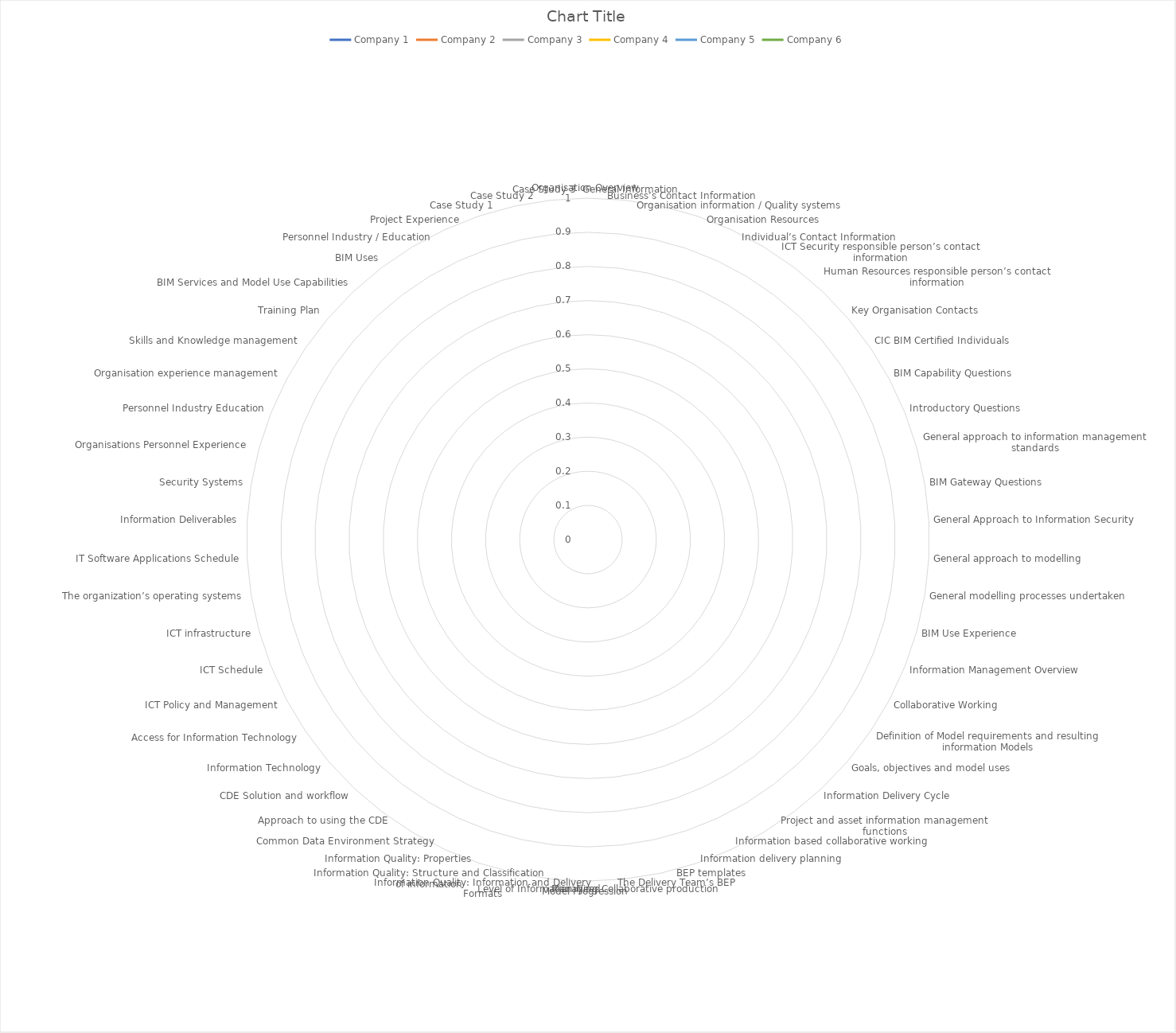
| Category | Company 1 | Company 2 | Company 3 | Company 4 | Company 5 | Company 6 |
|---|---|---|---|---|---|---|
| Organisation Overview | 0 | 0 | 0 | 0 | 0 | 0 |
| General Information | 0 | 0 | 0 | 0 | 0 | 0 |
| Business’s Contact Information | 0 | 0 | 0 | 0 | 0 | 0 |
| Organisation information / Quality systems | 0 | 0 | 0 | 0 | 0 | 0 |
| Organisation Resources | 0 | 0 | 0 | 0 | 0 | 0 |
| Individual’s Contact Information | 0 | 0 | 0 | 0 | 0 | 0 |
| ICT Security responsible person’s contact information | 0 | 0 | 0 | 0 | 0 | 0 |
| Human Resources responsible person’s contact information | 0 | 0 | 0 | 0 | 0 | 0 |
| Key Organisation Contacts | 0 | 0 | 0 | 0 | 0 | 0 |
| CIC BIM Certified Individuals | 0 | 0 | 0 | 0 | 0 | 0 |
| BIM Capability Questions | 0 | 0 | 0 | 0 | 0 | 0 |
| Introductory Questions | 0 | 0 | 0 | 0 | 0 | 0 |
| General approach to information management standards | 0 | 0 | 0 | 0 | 0 | 0 |
| BIM Gateway Questions | 0 | 0 | 0 | 0 | 0 | 0 |
| General Approach to Information Security | 0 | 0 | 0 | 0 | 0 | 0 |
| General approach to modelling | 0 | 0 | 0 | 0 | 0 | 0 |
| General modelling processes undertaken | 0 | 0 | 0 | 0 | 0 | 0 |
| BIM Use Experience | 0 | 0 | 0 | 0 | 0 | 0 |
| Information Management Overview | 0 | 0 | 0 | 0 | 0 | 0 |
| Collaborative Working | 0 | 0 | 0 | 0 | 0 | 0 |
| Definition of Model requirements and resulting information Models | 0 | 0 | 0 | 0 | 0 | 0 |
| Goals, objectives and model uses | 0 | 0 | 0 | 0 | 0 | 0 |
| Information Delivery Cycle | 0 | 0 | 0 | 0 | 0 | 0 |
| Project and asset information management functions | 0 | 0 | 0 | 0 | 0 | 0 |
| Information based collaborative working | 0 | 0 | 0 | 0 | 0 | 0 |
| Information delivery planning | 0 | 0 | 0 | 0 | 0 | 0 |
| BEP templates | 0 | 0 | 0 | 0 | 0 | 0 |
| The Delivery Team’s BEP | 0 | 0 | 0 | 0 | 0 | 0 |
| Managing Collaborative production | 0 | 0 | 0 | 0 | 0 | 0 |
| Model Progression | 0 | 0 | 0 | 0 | 0 | 0 |
| Level of Information Need | 0 | 0 | 0 | 0 | 0 | 0 |
| Information Quality: Information and Delivery Formats | 0 | 0 | 0 | 0 | 0 | 0 |
| Information Quality: Structure and Classification of information | 0 | 0 | 0 | 0 | 0 | 0 |
| Information Quality: Properties | 0 | 0 | 0 | 0 | 0 | 0 |
| Common Data Environment Strategy | 0 | 0 | 0 | 0 | 0 | 0 |
| Approach to using the CDE | 0 | 0 | 0 | 0 | 0 | 0 |
| CDE Solution and workflow | 0 | 0 | 0 | 0 | 0 | 0 |
|  Information Technology | 0 | 0 | 0 | 0 | 0 | 0 |
| Access for Information Technology | 0 | 0 | 0 | 0 | 0 | 0 |
| ICT Policy and Management | 0 | 0 | 0 | 0 | 0 | 0 |
| ICT Schedule | 0 | 0 | 0 | 0 | 0 | 0 |
| ICT infrastructure | 0 | 0 | 0 | 0 | 0 | 0 |
| The organization’s operating systems | 0 | 0 | 0 | 0 | 0 | 0 |
| IT Software Applications Schedule | 0 | 0 | 0 | 0 | 0 | 0 |
| Information Deliverables | 0 | 0 | 0 | 0 | 0 | 0 |
| Security Systems | 0 | 0 | 0 | 0 | 0 | 0 |
| Organisations Personnel Experience  | 0 | 0 | 0 | 0 | 0 | 0 |
| Personnel Industry Education | 0 | 0 | 0 | 0 | 0 | 0 |
| Organisation experience management | 0 | 0 | 0 | 0 | 0 | 0 |
| Skills and Knowledge management | 0 | 0 | 0 | 0 | 0 | 0 |
| Training Plan | 0 | 0 | 0 | 0 | 0 | 0 |
| BIM Services and Model Use Capabilities | 0 | 0 | 0 | 0 | 0 | 0 |
| BIM Uses | 0 | 0 | 0 | 0 | 0 | 0 |
| Personnel Industry / Education | 0 | 0 | 0 | 0 | 0 | 0 |
| Project Experience | 0 | 0 | 0 | 0 | 0 | 0 |
| Case Study 1 | 0 | 0 | 0 | 0 | 0 | 0 |
| Case Study 2 | 0 | 0 | 0 | 0 | 0 | 0 |
| Case Study 3 | 0 | 0 | 0 | 0 | 0 | 0 |